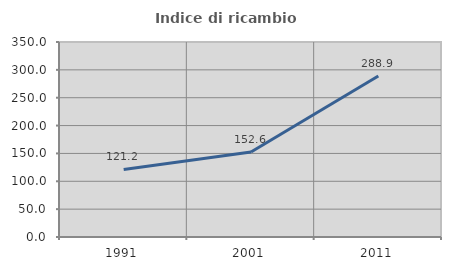
| Category | Indice di ricambio occupazionale  |
|---|---|
| 1991.0 | 121.212 |
| 2001.0 | 152.56 |
| 2011.0 | 288.937 |